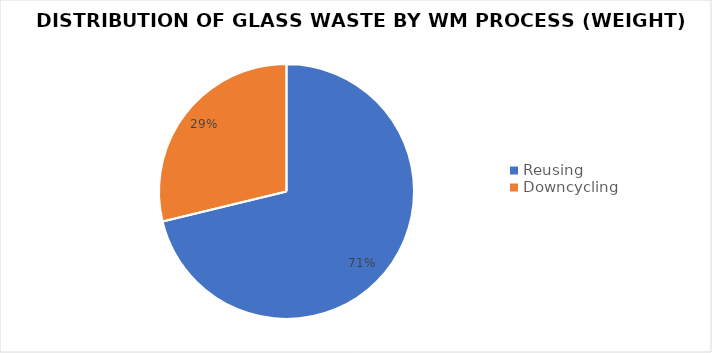
| Category | Series 0 |
|---|---|
| Reusing  | 1117.94 |
| Downcycling | 451.689 |